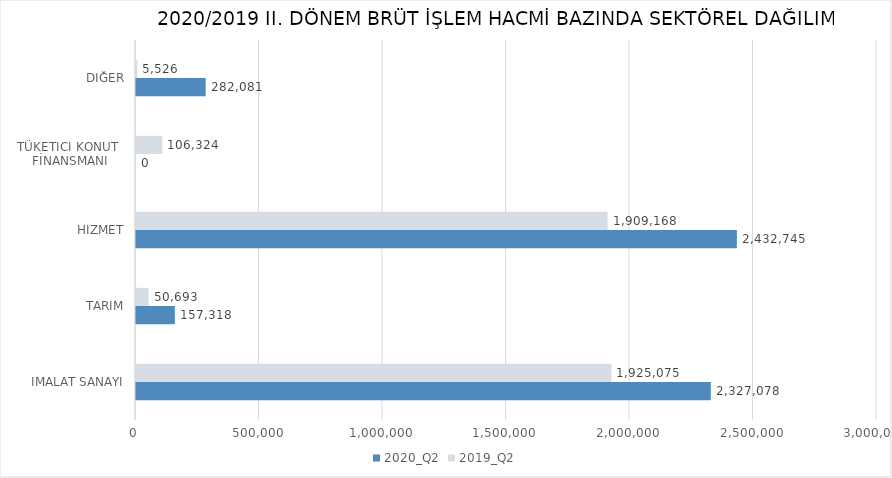
| Category | 2020_Q2 | 2019_Q2 |
|---|---|---|
| İMALAT SANAYİ | 2327078.197 | 1925075.184 |
| TARIM | 157318.45 | 50693.285 |
| HİZMET | 2432744.562 | 1909168.04 |
| TÜKETİCİ KONUT 
FİNANSMANI | 0 | 106324 |
| DİĞER | 282081.38 | 5525.75 |